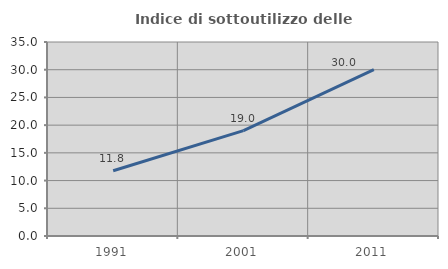
| Category | Indice di sottoutilizzo delle abitazioni  |
|---|---|
| 1991.0 | 11.78 |
| 2001.0 | 19.012 |
| 2011.0 | 30.026 |